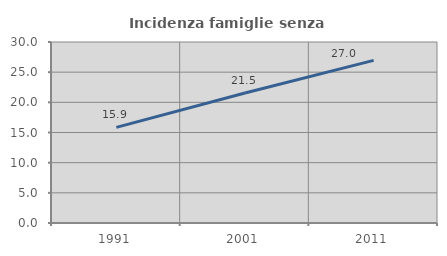
| Category | Incidenza famiglie senza nuclei |
|---|---|
| 1991.0 | 15.85 |
| 2001.0 | 21.536 |
| 2011.0 | 26.958 |